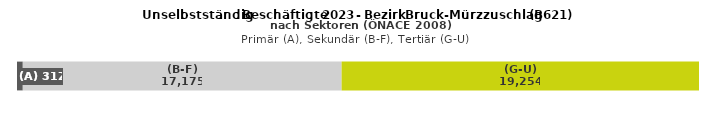
| Category | (A) | (B-F) | (G-U) |
|---|---|---|---|
| 0 | 312 | 17175 | 19254 |